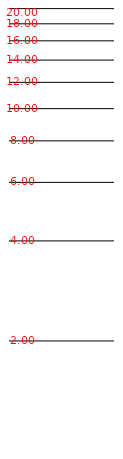
| Category | Series 0 |
|---|---|
| 0.0 | 0.693 |
| 0.0 | 1.386 |
| 0.0 | 1.792 |
| 0.0 | 2.079 |
| 0.0 | 2.303 |
| 0.0 | 2.485 |
| 0.0 | 2.639 |
| 0.0 | 2.773 |
| 0.0 | 2.89 |
| 0.0 | 2.996 |
| 0.0 | 3.091 |
| 0.0 | 3.178 |
| 0.0 | 3.258 |
| 0.0 | 3.332 |
| 0.0 | 3.401 |
| 0.0 | 3.466 |
| 0.0 | 3.526 |
| 0.0 | 3.584 |
| 0.0 | 3.638 |
| 0.0 | 3.689 |
| 0.0 | 3.738 |
| 0.0 | 3.784 |
| 0.0 | 3.829 |
| 0.0 | 3.871 |
| 0.0 | 3.912 |
| 0.0 | 3.951 |
| 0.0 | 3.989 |